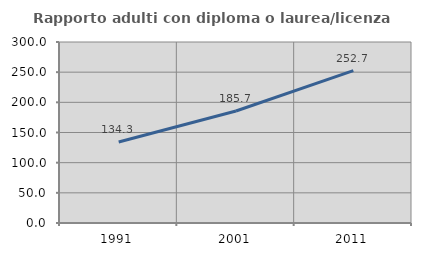
| Category | Rapporto adulti con diploma o laurea/licenza media  |
|---|---|
| 1991.0 | 134.283 |
| 2001.0 | 185.696 |
| 2011.0 | 252.653 |